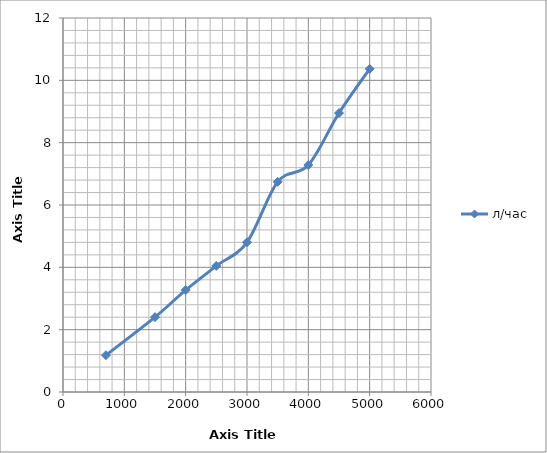
| Category | л/час |
|---|---|
| 700.0 | 1.18 |
| 1500.0 | 2.402 |
| 2000.0 | 3.27 |
| 2500.0 | 4.046 |
| 3000.0 | 4.804 |
| 3500.0 | 6.743 |
| 4000.0 | 7.282 |
| 4500.0 | 8.951 |
| 5000.0 | 10.367 |